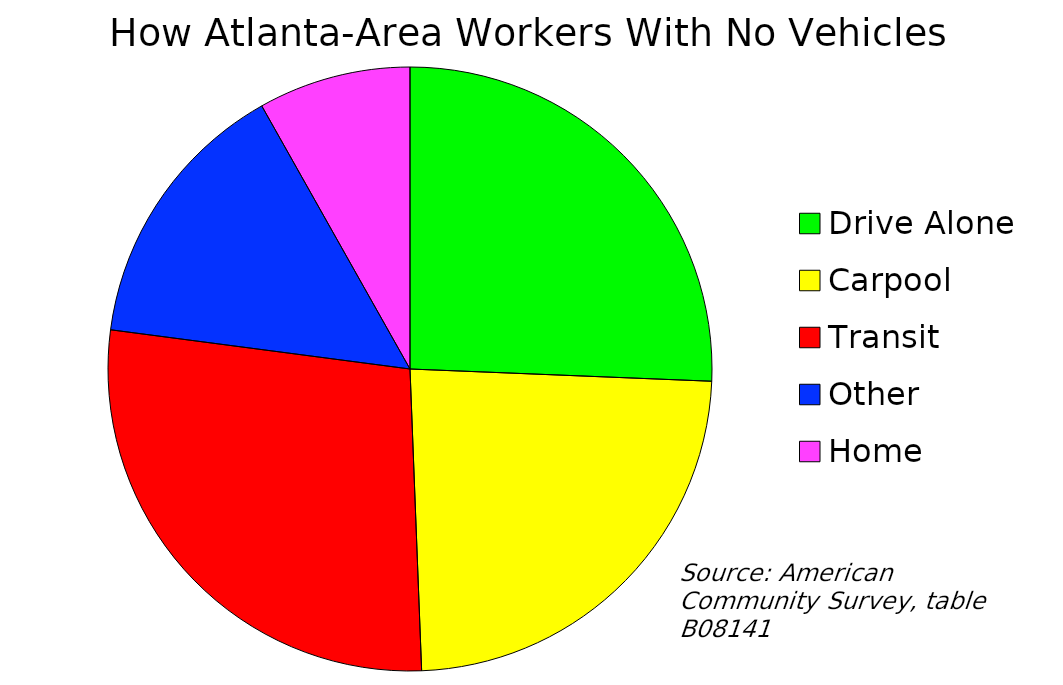
| Category | How Workers With No Vehicles Got to Work in 2017 |
|---|---|
| Drive Alone | 0.503 |
| Carpool | 0.465 |
| Transit | 0.543 |
| Other | 0.289 |
| Home | 0.16 |